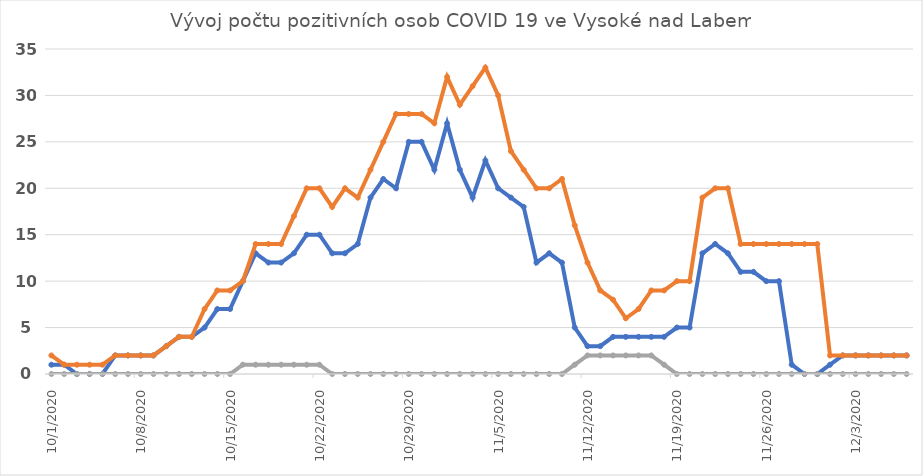
| Category | Series 0 | Series 1 | Series 2 |
|---|---|---|---|
| 10/1/20 | 1 | 2 | 0 |
| 10/2/20 | 1 | 1 | 0 |
| 10/3/20 | 0 | 1 | 0 |
| 10/4/20 | 0 | 1 | 0 |
| 10/5/20 | 0 | 1 | 0 |
| 10/6/20 | 2 | 2 | 0 |
| 10/7/20 | 2 | 2 | 0 |
| 10/8/20 | 2 | 2 | 0 |
| 10/9/20 | 2 | 2 | 0 |
| 10/10/20 | 3 | 3 | 0 |
| 10/11/20 | 4 | 4 | 0 |
| 10/12/20 | 4 | 4 | 0 |
| 10/13/20 | 5 | 7 | 0 |
| 10/14/20 | 7 | 9 | 0 |
| 10/15/20 | 7 | 9 | 0 |
| 10/16/20 | 10 | 10 | 1 |
| 10/17/20 | 13 | 14 | 1 |
| 10/18/20 | 12 | 14 | 1 |
| 10/19/20 | 12 | 14 | 1 |
| 10/20/20 | 13 | 17 | 1 |
| 10/21/20 | 15 | 20 | 1 |
| 10/22/20 | 15 | 20 | 1 |
| 10/23/20 | 13 | 18 | 0 |
| 10/24/20 | 13 | 20 | 0 |
| 10/25/20 | 14 | 19 | 0 |
| 10/26/20 | 19 | 22 | 0 |
| 10/27/20 | 21 | 25 | 0 |
| 10/28/20 | 20 | 28 | 0 |
| 10/29/20 | 25 | 28 | 0 |
| 10/30/20 | 25 | 28 | 0 |
| 10/31/20 | 22 | 27 | 0 |
| 11/1/20 | 27 | 32 | 0 |
| 11/2/20 | 22 | 29 | 0 |
| 11/3/20 | 19 | 31 | 0 |
| 11/4/20 | 23 | 33 | 0 |
| 11/5/20 | 20 | 30 | 0 |
| 11/6/20 | 19 | 24 | 0 |
| 11/7/20 | 18 | 22 | 0 |
| 11/8/20 | 12 | 20 | 0 |
| 11/9/20 | 13 | 20 | 0 |
| 11/10/20 | 12 | 21 | 0 |
| 11/11/20 | 5 | 16 | 1 |
| 11/12/20 | 3 | 12 | 2 |
| 11/13/20 | 3 | 9 | 2 |
| 11/14/20 | 4 | 8 | 2 |
| 11/15/20 | 4 | 6 | 2 |
| 11/16/20 | 4 | 7 | 2 |
| 11/17/20 | 4 | 9 | 2 |
| 11/18/20 | 4 | 9 | 1 |
| 11/19/20 | 5 | 10 | 0 |
| 11/20/20 | 5 | 10 | 0 |
| 11/21/20 | 13 | 19 | 0 |
| 11/22/20 | 14 | 20 | 0 |
| 11/23/20 | 13 | 20 | 0 |
| 11/24/20 | 11 | 14 | 0 |
| 11/25/20 | 11 | 14 | 0 |
| 11/26/20 | 10 | 14 | 0 |
| 11/27/20 | 10 | 14 | 0 |
| 11/28/20 | 1 | 14 | 0 |
| 11/29/20 | 0 | 14 | 0 |
| 11/30/20 | 0 | 14 | 0 |
| 12/1/20 | 1 | 2 | 0 |
| 12/2/20 | 2 | 2 | 0 |
| 12/3/20 | 2 | 2 | 0 |
| 12/4/20 | 2 | 2 | 0 |
| 12/5/20 | 2 | 2 | 0 |
| 12/6/20 | 2 | 2 | 0 |
| 12/7/20 | 2 | 2 | 0 |